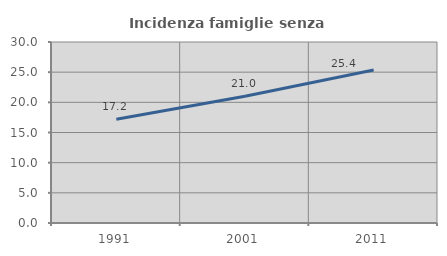
| Category | Incidenza famiglie senza nuclei |
|---|---|
| 1991.0 | 17.19 |
| 2001.0 | 21.021 |
| 2011.0 | 25.355 |